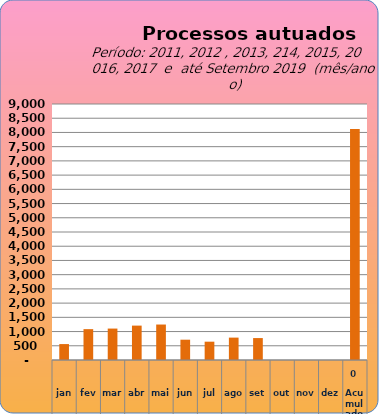
| Category | 6735 4276 7967 6893 5569 5.644 6997 12080  560   1.085   1.105   1.209   1.247   714   644   787   771   -     -     -     8.122  |
|---|---|
| jan | 560 |
| fev | 1085 |
| mar | 1105 |
| abr | 1209 |
| mai | 1247 |
| jun | 714 |
| jul | 644 |
| ago | 787 |
| set | 771 |
| out | 0 |
| nov | 0 |
| dez | 0 |
| Acumulado
 | 8122 |